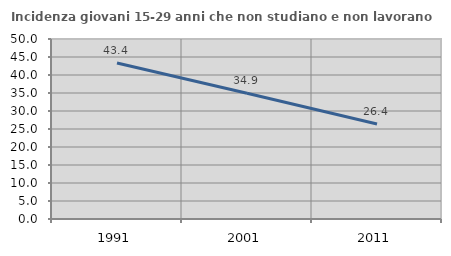
| Category | Incidenza giovani 15-29 anni che non studiano e non lavorano  |
|---|---|
| 1991.0 | 43.357 |
| 2001.0 | 34.921 |
| 2011.0 | 26.389 |